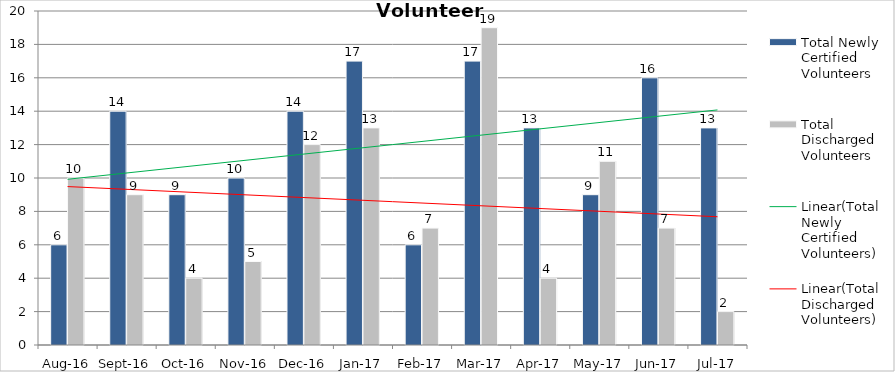
| Category | Total Newly Certified Volunteers | Total Discharged Volunteers |
|---|---|---|
| Aug-16 | 6 | 10 |
| Sep-16 | 14 | 9 |
| Oct-16 | 9 | 4 |
| Nov-16 | 10 | 5 |
| Dec-16 | 14 | 12 |
| Jan-17 | 17 | 13 |
| Feb-17 | 6 | 7 |
| Mar-17 | 17 | 19 |
| Apr-17 | 13 | 4 |
| May-17 | 9 | 11 |
| Jun-17 | 16 | 7 |
| Jul-17 | 13 | 2 |